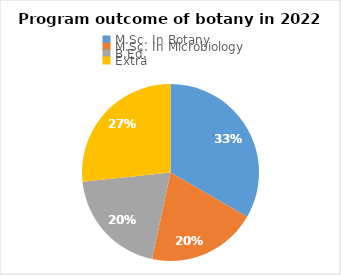
| Category | Series 0 |
|---|---|
| M.Sc. In Botany | 5 |
| M.Sc. In Microbiology | 3 |
| B.Ed. | 3 |
| Extra | 4 |